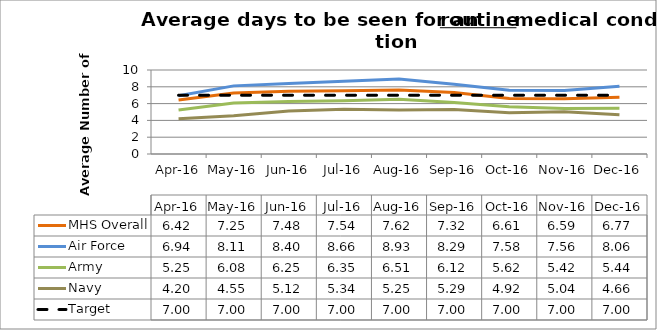
| Category | MHS Overall | Air Force | Army | Navy | Target |
|---|---|---|---|---|---|
| 2016-04-01 | 6.42 | 6.94 | 5.25 | 4.2 | 7 |
| 2016-05-01 | 7.25 | 8.11 | 6.08 | 4.55 | 7 |
| 2016-06-01 | 7.48 | 8.4 | 6.25 | 5.12 | 7 |
| 2016-07-01 | 7.54 | 8.66 | 6.35 | 5.34 | 7 |
| 2016-08-01 | 7.62 | 8.93 | 6.51 | 5.25 | 7 |
| 2016-09-01 | 7.32 | 8.29 | 6.12 | 5.29 | 7 |
| 2016-10-01 | 6.61 | 7.58 | 5.62 | 4.92 | 7 |
| 2016-11-01 | 6.59 | 7.56 | 5.42 | 5.04 | 7 |
| 2016-12-01 | 6.77 | 8.06 | 5.44 | 4.66 | 7 |